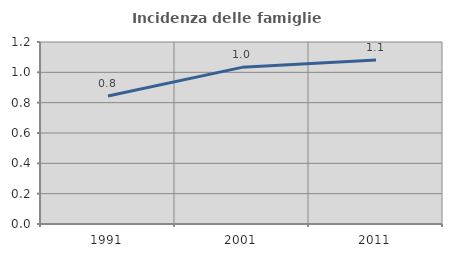
| Category | Incidenza delle famiglie numerose |
|---|---|
| 1991.0 | 0.844 |
| 2001.0 | 1.033 |
| 2011.0 | 1.081 |